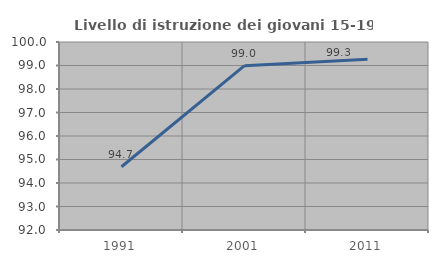
| Category | Livello di istruzione dei giovani 15-19 anni |
|---|---|
| 1991.0 | 94.692 |
| 2001.0 | 98.992 |
| 2011.0 | 99.265 |